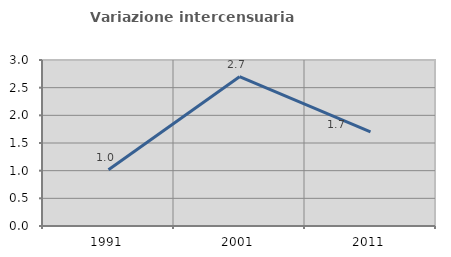
| Category | Variazione intercensuaria annua |
|---|---|
| 1991.0 | 1.015 |
| 2001.0 | 2.698 |
| 2011.0 | 1.701 |